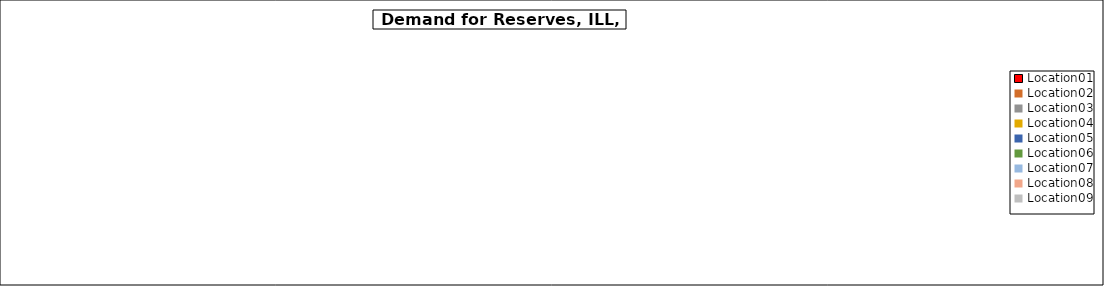
| Category | Series 0 |
|---|---|
| Location01 | 0 |
| Location02 | 0 |
| Location03 | 0 |
| Location04 | 0 |
| Location05 | 0 |
| Location06 | 0 |
| Location07 | 0 |
| Location08 | 0 |
| Location09 | 0 |